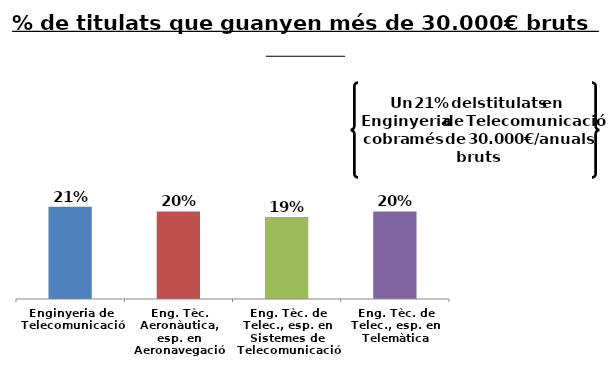
| Category | Series 0 |
|---|---|
| Enginyeria de Telecomunicació | 0.211 |
| Eng. Tèc. Aeronàutica, esp. en Aeronavegació | 0.2 |
| Eng. Tèc. de Telec., esp. en Sistemes de Telecomunicació | 0.188 |
| Eng. Tèc. de Telec., esp. en Telemàtica | 0.2 |